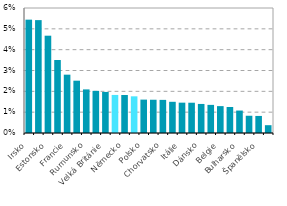
| Category | Series 0 |
|---|---|
| Irsko | 0.054 |
| Maďarsko | 0.054 |
| Estonsko | 0.047 |
| Finsko | 0.035 |
| Francie | 0.028 |
| Slovensko | 0.025 |
| Rumunsko | 0.021 |
| Rakousko | 0.02 |
| Velká Británie | 0.02 |
| Česko | 0.018 |
| Německo | 0.018 |
| EU28 | 0.018 |
| Polsko | 0.016 |
| Slovinsko | 0.016 |
| Chorvatsko | 0.016 |
| Švédsko | 0.015 |
| Itálie | 0.015 |
| Nizozemsko | 0.015 |
| Dánsko | 0.014 |
| Lotyšsko | 0.013 |
| Belgie | 0.013 |
| Portugalsko | 0.012 |
| Bulharsko | 0.011 |
| Litva | 0.008 |
| Španělsko | 0.008 |
| Řecko | 0.004 |